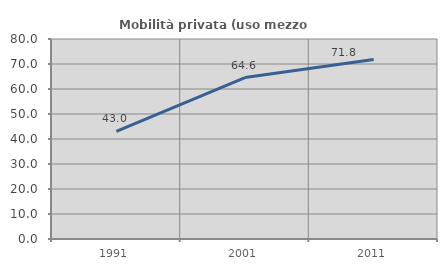
| Category | Mobilità privata (uso mezzo privato) |
|---|---|
| 1991.0 | 43.046 |
| 2001.0 | 64.564 |
| 2011.0 | 71.807 |